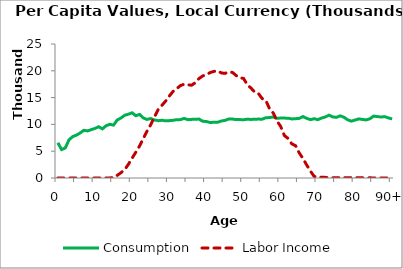
| Category | Consumption | Labor Income |
|---|---|---|
| 0 | 6575.914 | 0 |
|  | 5302.167 | 0 |
| 2 | 5606.779 | 0 |
| 3 | 7119.768 | 0 |
| 4 | 7728.967 | 0 |
| 5 | 7998.442 | 0 |
| 6 | 8396.991 | 0 |
| 7 | 8898.404 | 0 |
| 8 | 8783.722 | 0 |
| 9 | 9020.59 | 0 |
| 10 | 9250.472 | 0 |
| 11 | 9565.583 | 0 |
| 12 | 9168.036 | 0 |
| 13 | 9759.03 | 0 |
| 14 | 10019.171 | 12.024 |
| 15 | 9864.845 | 91.297 |
| 16 | 10837.419 | 497.057 |
| 17 | 11194.596 | 989.696 |
| 18 | 11705.614 | 1563.448 |
| 19 | 11904.532 | 2561.652 |
| 20 | 12162.6 | 3716.974 |
| 21 | 11611.486 | 4828.798 |
| 22 | 11862.586 | 5962.59 |
| 23 | 11203.122 | 7355.242 |
| 24 | 10928.957 | 8724.203 |
| 25 | 11093.865 | 9943.31 |
| 26 | 10830.405 | 11391.64 |
| 27 | 10692.757 | 12752.58 |
| 28 | 10771.733 | 13544.856 |
| 29 | 10658.84 | 14336.279 |
| 30 | 10698.32 | 15273.988 |
| 31 | 10763.656 | 16146.593 |
| 32 | 10878.873 | 16671.77 |
| 33 | 10892.197 | 17238.513 |
| 34 | 11108.98 | 17500.435 |
| 35 | 10878.903 | 17401.026 |
| 36 | 10936.901 | 17305.362 |
| 37 | 10975.518 | 17778.314 |
| 38 | 10988.221 | 18550.229 |
| 39 | 10587.207 | 19043.885 |
| 40 | 10535.895 | 19300.914 |
| 41 | 10345.848 | 19665.841 |
| 42 | 10406.617 | 19888.591 |
| 43 | 10402.115 | 19980.861 |
| 44 | 10634.157 | 19605.698 |
| 45 | 10745.275 | 19516.677 |
| 46 | 11008.671 | 19793.136 |
| 47 | 10995.921 | 19701.835 |
| 48 | 10895.986 | 19118.244 |
| 49 | 10898.251 | 18711.534 |
| 50 | 10866.667 | 18566.538 |
| 51 | 10968.243 | 17400.016 |
| 52 | 10925.633 | 16778.78 |
| 53 | 10969.724 | 16017.261 |
| 54 | 10988.694 | 15763.97 |
| 55 | 10973.537 | 14826.658 |
| 56 | 11246.508 | 14463.557 |
| 57 | 11273.01 | 12896.797 |
| 58 | 11381.887 | 12120.077 |
| 59 | 11139.056 | 10636.345 |
| 60 | 11185.182 | 9604.337 |
| 61 | 11173.074 | 7912.745 |
| 62 | 11159.673 | 7369.782 |
| 63 | 11018.556 | 6355.886 |
| 64 | 11063.198 | 6026.918 |
| 65 | 11127.557 | 4656.449 |
| 66 | 11465.81 | 3643.985 |
| 67 | 11129.488 | 2410.585 |
| 68 | 10885.526 | 1293.18 |
| 69 | 11063.667 | 297.599 |
| 70 | 10886.753 | 209.111 |
| 71 | 11189.928 | 130.612 |
| 72 | 11381.847 | 116.106 |
| 73 | 11729.169 | 53.8 |
| 74 | 11397.274 | 47.925 |
| 75 | 11315.378 | 34.104 |
| 76 | 11598.748 | 56.469 |
| 77 | 11346.627 | 54.01 |
| 78 | 10863.591 | 61.924 |
| 79 | 10605.406 | 66.664 |
| 80 | 10805.689 | 81.244 |
| 81 | 11027.533 | 40.564 |
| 82 | 10927.042 | 39.287 |
| 83 | 10836.395 | 31.163 |
| 84 | 11050.854 | 31.015 |
| 85 | 11542.57 | 12.779 |
| 86 | 11458.444 | 11.786 |
| 87 | 11384.189 | 12.218 |
| 88 | 11449.362 | 3.114 |
| 89 | 11210.68 | 0 |
| 90+ | 11017.609 | 0 |